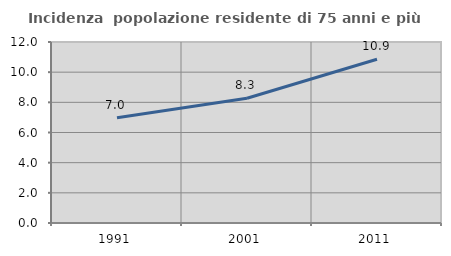
| Category | Incidenza  popolazione residente di 75 anni e più |
|---|---|
| 1991.0 | 6.971 |
| 2001.0 | 8.273 |
| 2011.0 | 10.854 |